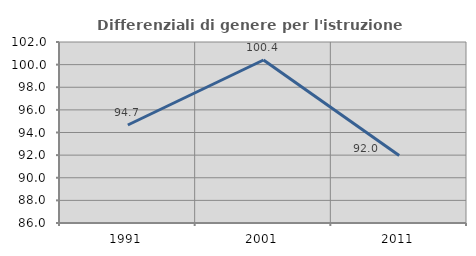
| Category | Differenziali di genere per l'istruzione superiore |
|---|---|
| 1991.0 | 94.664 |
| 2001.0 | 100.41 |
| 2011.0 | 91.969 |